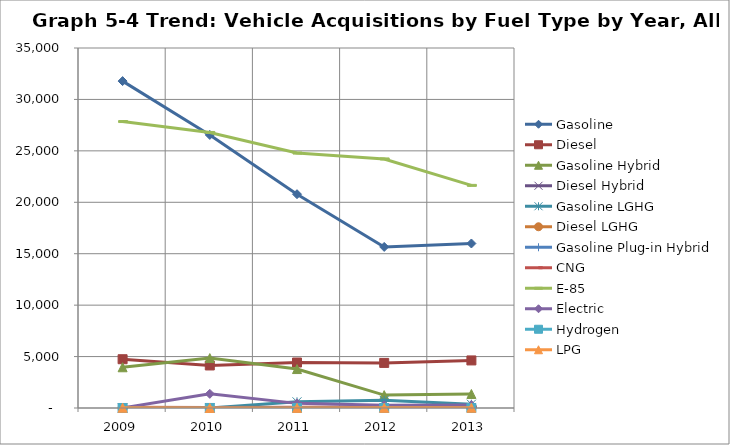
| Category | Gasoline | Diesel | Gasoline Hybrid | Diesel Hybrid | Gasoline LGHG | Diesel LGHG | Gasoline Plug-in Hybrid | CNG | E-85 | Electric | Hydrogen | LPG |
|---|---|---|---|---|---|---|---|---|---|---|---|---|
| 2009.0 | 31782 | 4742 | 3959 | 4 | 0 | 0 | 0 | 77 | 27850 | 7 | 1 | 23 |
| 2010.0 | 26547 | 4136 | 4853 | 27 | 0 | 0 | 0 | 60 | 26789 | 1376 | 4 | 2 |
| 2011.0 | 20785 | 4422 | 3787 | 50 | 601 | 14 | 6 | 84 | 24785 | 450 | 4 | 11 |
| 2012.0 | 15660 | 4383 | 1254 | 36 | 745 | 10 | 144 | 106 | 24214 | 258 | 0 | 15 |
| 2013.0 | 15994 | 4625 | 1364 | 51 | 369 | 0 | 258 | 123 | 21644 | 284 | 2 | 23 |